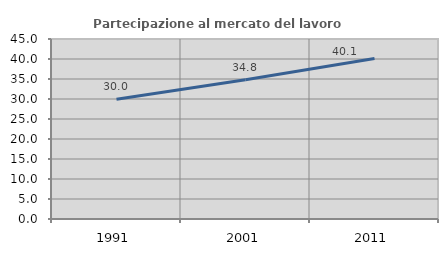
| Category | Partecipazione al mercato del lavoro  femminile |
|---|---|
| 1991.0 | 29.96 |
| 2001.0 | 34.83 |
| 2011.0 | 40.102 |